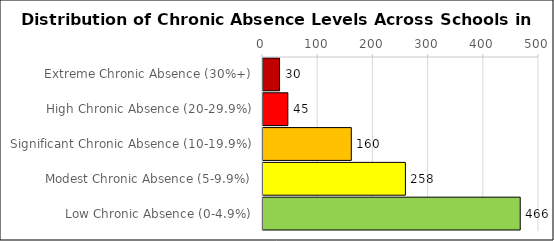
| Category | Number of Schools |
|---|---|
| Extreme Chronic Absence (30%+) | 30 |
| High Chronic Absence (20-29.9%) | 45 |
| Significant Chronic Absence (10-19.9%) | 160 |
| Modest Chronic Absence (5-9.9%) | 258 |
| Low Chronic Absence (0-4.9%) | 466 |